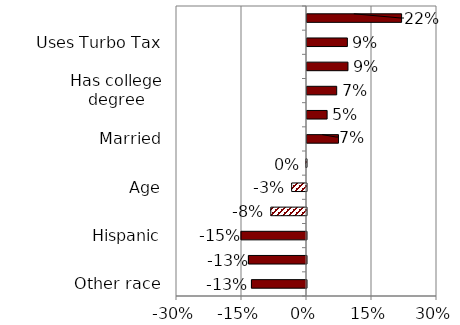
| Category | Series 0 |
|---|---|
| Other race | -0.127 |
| Black | -0.134 |
| Hispanic | -0.151 |
| Asian | -0.082 |
| Age | -0.034 |
| Female | -0.002 |
| Married | 0.073 |
| Income | 0.046 |
| Has college degree | 0.069 |
| Lives in metropolitan area | 0.095 |
| Uses Turbo Tax | 0.093 |
| Uses online banking | 0.218 |